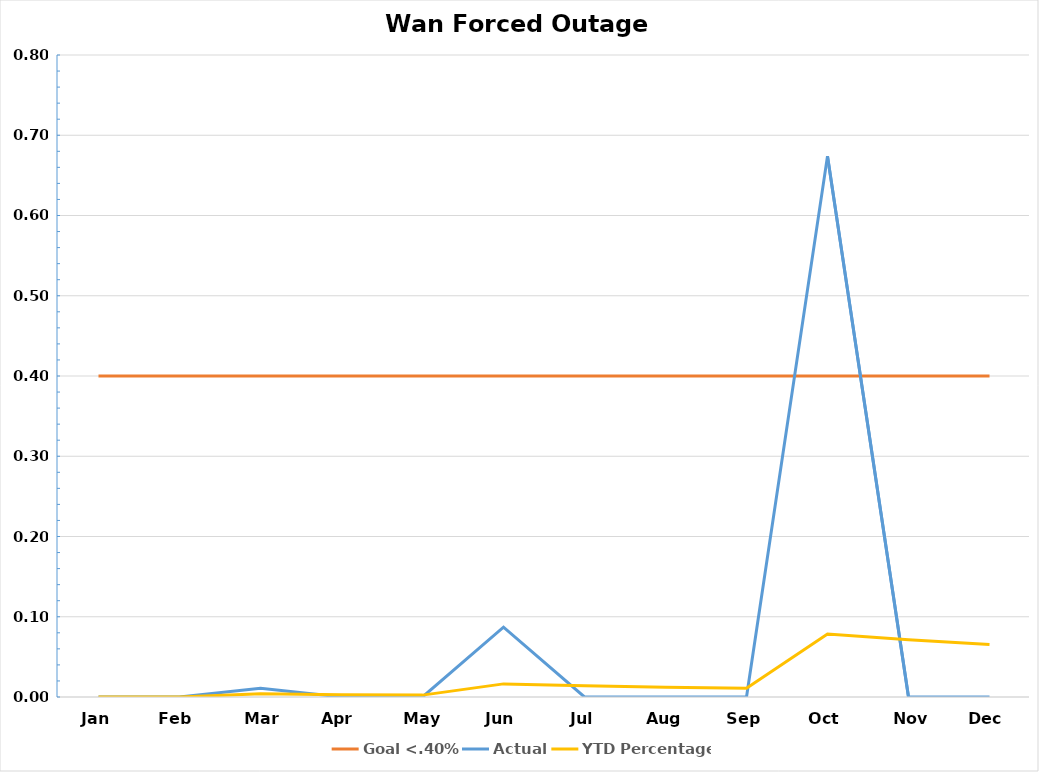
| Category | Goal <.40% | Actual | YTD Percentage |
|---|---|---|---|
| Jan | 0.4 | 0 | 0 |
| Feb | 0.4 | 0 | 0 |
| Mar | 0.4 | 0.011 | 0.004 |
| Apr | 0.4 | 0 | 0.003 |
| May | 0.4 | 0 | 0.002 |
| Jun | 0.4 | 0.087 | 0.016 |
| Jul | 0.4 | 0 | 0.014 |
| Aug | 0.4 | 0 | 0.012 |
| Sep | 0.4 | 0 | 0.011 |
| Oct | 0.4 | 0.674 | 0.078 |
| Nov | 0.4 | 0 | 0.071 |
| Dec | 0.4 | 0 | 0.065 |